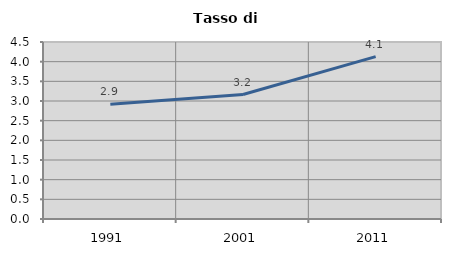
| Category | Tasso di disoccupazione   |
|---|---|
| 1991.0 | 2.92 |
| 2001.0 | 3.165 |
| 2011.0 | 4.128 |